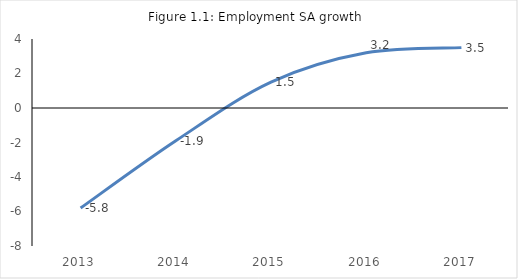
| Category | Employment SA (persons, Statistical Service) |
|---|---|
| 2013.0 | -5.8 |
| 2014.0 | -1.9 |
| 2015.0 | 1.5 |
| 2016.0 | 3.2 |
| 2017.0 | 3.5 |